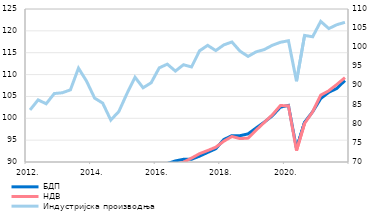
| Category | БДП | НДВ |
|---|---|---|
| 2012. | 84.024 | 84.494 |
| II | 85.251 | 85.857 |
| III | 84.299 | 84.659 |
| IV | 84.139 | 84.858 |
| 2013. | 86.026 | 86.24 |
| II | 86.173 | 85.95 |
| III | 87.889 | 88.328 |
| IV | 87.227 | 87.378 |
| 2014. | 86.15 | 86.04 |
| II | 85.49 | 85.033 |
| III | 84.574 | 84.08 |
| IV | 85.877 | 85.282 |
| 2015. | 86.251 | 86.137 |
| II | 87.022 | 86.937 |
| III | 86.911 | 87.029 |
| IV | 87.906 | 88.071 |
| 2016. | 89.156 | 88.746 |
| II | 89.647 | 89.092 |
| III | 90.243 | 89.356 |
| IV | 90.611 | 89.952 |
| 2017. | 90.63 | 90.897 |
| II | 91.344 | 91.908 |
| III | 92.197 | 92.623 |
| IV | 93.033 | 93.385 |
| 2018. | 95.145 | 94.758 |
| II | 96.029 | 95.834 |
| III | 96.021 | 95.353 |
| IV | 96.431 | 95.466 |
| 2019. | 97.789 | 97.287 |
| II | 99.113 | 99.042 |
| III | 100.562 | 100.773 |
| IV | 102.537 | 102.897 |
| 2020. | 102.944 | 102.894 |
| II | 93.083 | 92.606 |
| III | 99.099 | 98.825 |
| IV | 101.494 | 101.494 |
| 2021. | 104.528 | 105.299 |
| II | 105.94 | 106.305 |
| III | 106.844 | 107.769 |
| IV | 108.646 | 109.313 |